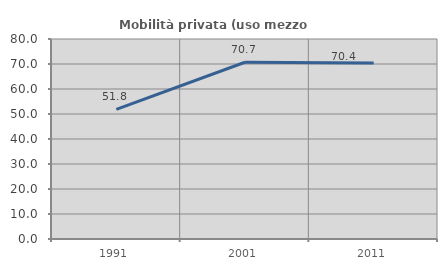
| Category | Mobilità privata (uso mezzo privato) |
|---|---|
| 1991.0 | 51.821 |
| 2001.0 | 70.709 |
| 2011.0 | 70.376 |